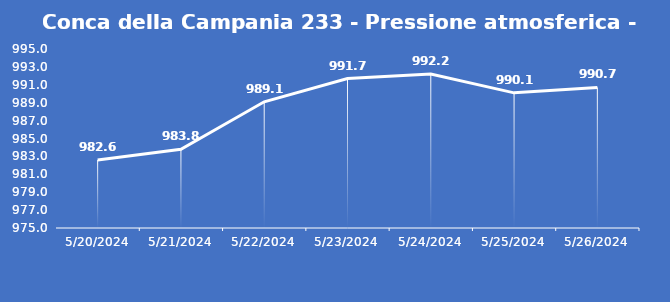
| Category | Conca della Campania 233 - Pressione atmosferica - Grezzo (hPa) |
|---|---|
| 5/20/24 | 982.6 |
| 5/21/24 | 983.8 |
| 5/22/24 | 989.1 |
| 5/23/24 | 991.7 |
| 5/24/24 | 992.2 |
| 5/25/24 | 990.1 |
| 5/26/24 | 990.7 |